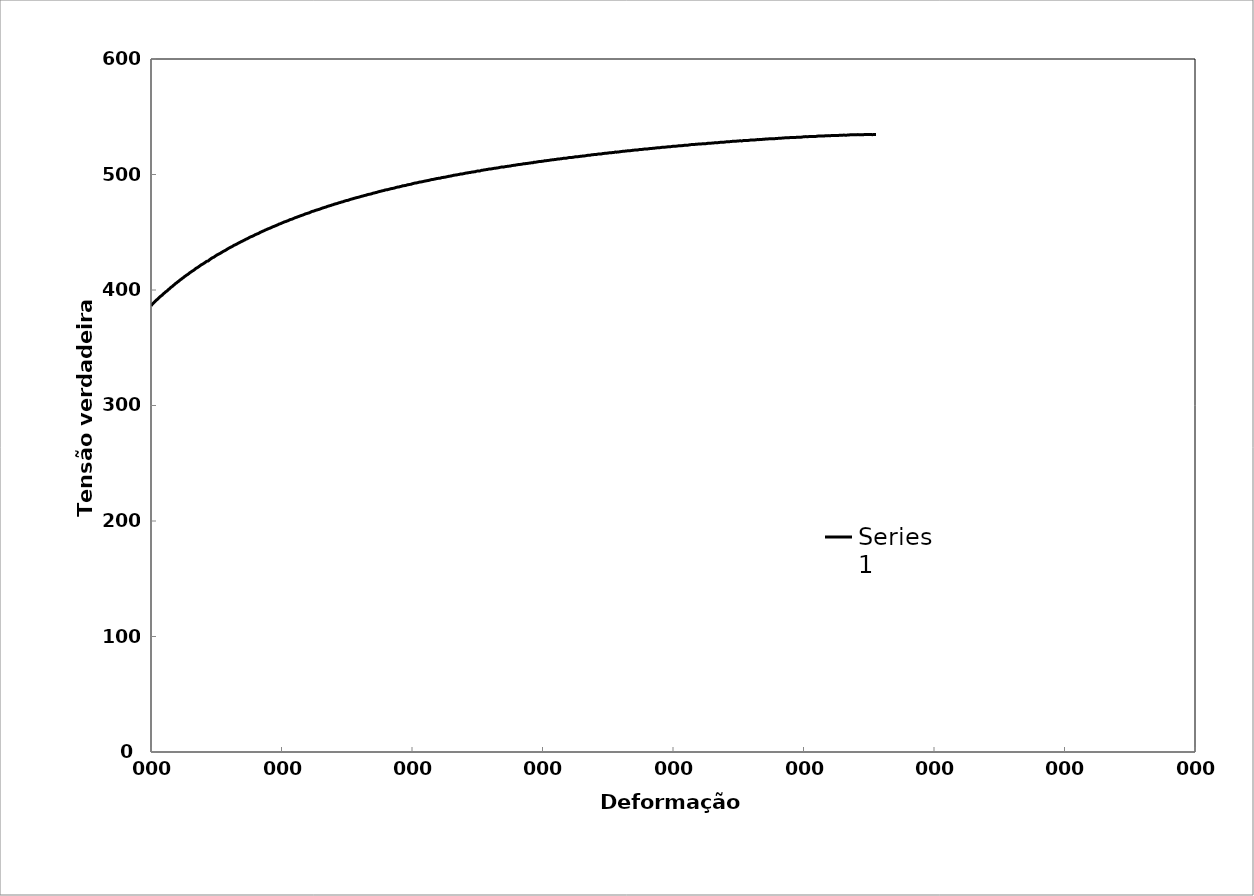
| Category | Series 0 |
|---|---|
| 0.0 | 386.33 |
| 0.00014041254800655975 | 387.275 |
| 0.00028080538309738917 | 388.129 |
| 0.00042117851080681473 | 388.952 |
| 0.0005615319366666198 | 389.682 |
| 0.0007028469516222463 | 390.444 |
| 0.0008510099999309989 | 391.363 |
| 0.0009913031146633437 | 391.91 |
| 0.0011315765499985038 | 392.857 |
| 0.001280656813322744 | 393.5 |
| 0.001428734282625771 | 394.358 |
| 0.0015777702554789427 | 395.001 |
| 0.001725803738766369 | 395.552 |
| 0.0018747954474575175 | 396.596 |
| 0.0020227849708534355 | 397.24 |
| 0.0021717324416675177 | 397.976 |
| 0.0023284952891937 | 398.716 |
| 0.0024930698349769007 | 399.367 |
| 0.0026497823207773906 | 400.23 |
| 0.0028064702516224713 | 400.971 |
| 0.0029631336352060923 | 401.834 |
| 0.0031276037773933438 | 402.578 |
| 0.0032920468736009 | 403.23 |
| 0.003457441518812377 | 404.098 |
| 0.003621830388882058 | 404.843 |
| 0.00378619223969252 | 405.711 |
| 0.003951505182849771 | 406.272 |
| 0.004115812861082431 | 407.11 |
| 0.004280093546736995 | 407.763 |
| 0.004453145792815149 | 408.636 |
| 0.004617371075079819 | 409.289 |
| 0.004790364969413308 | 410.039 |
| 0.004954534885644679 | 410.693 |
| 0.005127470467571657 | 411.567 |
| 0.005300376147954106 | 412.225 |
| 0.00546446236390806 | 412.879 |
| 0.005645121398791624 | 413.541 |
| 0.005817937605281008 | 414.292 |
| 0.005990723951489647 | 415.075 |
| 0.006163480447734227 | 415.734 |
| 0.0063352313313074435 | 416.392 |
| 0.006507928327052735 | 416.959 |
| 0.0066805955036954995 | 417.711 |
| 0.006853232871531088 | 418.588 |
| 0.007024865340524825 | 419.155 |
| 0.007206217644196131 | 419.726 |
| 0.007369991461223198 | 420.382 |
| 0.007550306603846268 | 421.139 |
| 0.007730589238780436 | 421.896 |
| 0.007903045449214791 | 422.371 |
| 0.008075471923632501 | 423.033 |
| 0.008246894762833929 | 423.601 |
| 0.008419261963827546 | 424.386 |
| 0.008591599459489119 | 424.924 |
| 0.008755146562879738 | 425.118 |
| 0.008927426187736141 | 425.966 |
| 0.009099676137435755 | 426.721 |
| 0.009270923509547814 | 427.414 |
| 0.009443114307104872 | 427.984 |
| 0.009623056055096994 | 428.433 |
| 0.009795186234561569 | 429.097 |
| 0.009967286790326737 | 429.791 |
| 0.010139357732587038 | 430.455 |
| 0.010310427169699744 | 430.901 |
| 0.010490212933580972 | 431.382 |
| 0.01067093793280997 | 431.956 |
| 0.010841916464734591 | 432.62 |
| 0.011013836987369147 | 433.192 |
| 0.011185727958417834 | 433.763 |
| 0.01137312342894765 | 434.248 |
| 0.011544952658298985 | 434.82 |
| 0.01171675236743841 | 435.486 |
| 0.011888522566507739 | 436.058 |
| 0.012068024860495474 | 436.634 |
| 0.012247494939192076 | 437.116 |
| 0.012419174004515799 | 437.564 |
| 0.01259082360119691 | 438.231 |
| 0.012770199886097008 | 438.807 |
| 0.012940819896360305 | 439.193 |
| 0.013121102591745357 | 439.677 |
| 0.013291662746593255 | 440.25 |
| 0.013463162659083656 | 440.824 |
| 0.013634633164397114 | 441.273 |
| 0.013813822329065771 | 441.85 |
| 0.01399297939073011 | 442.241 |
| 0.01416435907994524 | 442.815 |
| 0.014343453357103186 | 443.3 |
| 0.014514772997867208 | 443.843 |
| 0.014686063293239286 | 444.231 |
| 0.014865064168886263 | 444.716 |
| 0.01503532715789669 | 445.291 |
| 0.015206528318226976 | 445.866 |
| 0.015377700173736915 | 446.223 |
| 0.015556577299648683 | 446.615 |
| 0.015727689252236138 | 447.097 |
| 0.015906503789657737 | 447.645 |
| 0.01608528635815719 | 448.131 |
| 0.01625630787395014 | 448.52 |
| 0.016435027920100993 | 448.881 |
| 0.016613716031104314 | 449.461 |
| 0.016784647205648533 | 450.038 |
| 0.01696327286033983 | 450.431 |
| 0.017134144300270313 | 450.914 |
| 0.017312707542295087 | 451.276 |
| 0.017491238905180596 | 451.856 |
| 0.017662020162304608 | 452.246 |
| 0.017840489178386522 | 452.702 |
| 0.018011210805614394 | 453.092 |
| 0.01818961751842306 | 453.455 |
| 0.018367992407954163 | 453.849 |
| 0.018546335485558417 | 454.43 |
| 0.018716936662349103 | 454.821 |
| 0.018895217524563426 | 455.184 |
| 0.01907346660837752 | 455.578 |
| 0.019252647175664793 | 456.035 |
| 0.019422164821316708 | 456.426 |
| 0.01959261665873302 | 457.005 |
| 0.019770741486194114 | 457.274 |
| 0.01994113392349267 | 457.666 |
| 0.020127858391870493 | 458.159 |
| 0.020305887913484484 | 458.616 |
| 0.020475227125345878 | 459.008 |
| 0.020654156722798793 | 459.278 |
| 0.02082343697435332 | 459.669 |
| 0.021009996783180197 | 460.037 |
| 0.021180178209490017 | 460.524 |
| 0.021358020502297924 | 461.013 |
| 0.021535831172848206 | 461.19 |
| 0.021713610232384828 | 461.585 |
| 0.021891357692144925 | 462.044 |
| 0.022069073563360478 | 462.535 |
| 0.022247718227114424 | 462.837 |
| 0.022425370784313926 | 463.202 |
| 0.022602991786688273 | 463.599 |
| 0.02278058124544486 | 463.964 |
| 0.02295046164333503 | 464.357 |
| 0.023135665576904926 | 464.632 |
| 0.02331411981825743 | 465.029 |
| 0.023491583044265865 | 465.395 |
| 0.023669014782665525 | 465.886 |
| 0.023846415044628443 | 466.158 |
| 0.024016114490061066 | 466.457 |
| 0.02420112118390076 | 466.732 |
| 0.024379385408372395 | 467.225 |
| 0.024556659706315473 | 467.717 |
| 0.024733902583651615 | 468.083 |
| 0.02491111405151742 | 468.26 |
| 0.025088294121042735 | 468.658 |
| 0.025265442803352335 | 469.056 |
| 0.0254435174151703 | 469.329 |
| 0.025620603186886963 | 469.601 |
| 0.02579765760478553 | 469.905 |
| 0.025974680679966264 | 470.272 |
| 0.026151672423524404 | 470.671 |
| 0.026328632846548655 | 471.038 |
| 0.026505561960121826 | 471.342 |
| 0.026683415894700566 | 471.615 |
| 0.026860282253507305 | 471.919 |
| 0.02703711733613657 | 472.382 |
| 0.027213921153648082 | 472.686 |
| 0.027390693717095668 | 472.959 |
| 0.027576032467181995 | 473.236 |
| 0.027752741036526973 | 473.636 |
| 0.027929418385470098 | 473.909 |
| 0.028106064525041705 | 474.309 |
| 0.02829127074888211 | 474.586 |
| 0.02846785298583599 | 474.796 |
| 0.028644404047008472 | 475.165 |
| 0.028829510603076168 | 475.569 |
| 0.029005997830390567 | 475.748 |
| 0.02918245391545969 | 476.116 |
| 0.02935887886927186 | 476.327 |
| 0.029543853230827304 | 476.7 |
| 0.029727840171133384 | 477.104 |
| 0.029905121983913464 | 477.378 |
| 0.030081419498337002 | 477.557 |
| 0.03026530756914033 | 477.74 |
| 0.030442494132765688 | 478.237 |
| 0.030618696943608872 | 478.543 |
| 0.030794868712490896 | 478.817 |
| 0.030978625647333058 | 479.095 |
| 0.03115568587683163 | 479.402 |
| 0.031339376527065664 | 479.68 |
| 0.03151542138946081 | 479.955 |
| 0.03169143526551708 | 480.166 |
| 0.03187597870652035 | 480.445 |
| 0.03206048809752561 | 480.724 |
| 0.032244012634463075 | 481.129 |
| 0.032428454138507264 | 481.313 |
| 0.032604307395596506 | 481.62 |
| 0.03278012973375483 | 481.895 |
| 0.032955921163852604 | 482.075 |
| 0.03314023142124018 | 482.482 |
| 0.0333159595655046 | 482.757 |
| 0.033507800440735216 | 482.945 |
| 0.03368346401031943 | 483.125 |
| 0.033859096727633285 | 483.432 |
| 0.034043240610969805 | 483.808 |
| 0.03421881015665306 | 484.02 |
| 0.03440288781896907 | 484.299 |
| 0.03457839423844815 | 484.48 |
| 0.03476145730133894 | 484.887 |
| 0.03494543511072013 | 485.167 |
| 0.03512937907849299 | 485.447 |
| 0.03530475805157238 | 485.659 |
| 0.03548768820451629 | 485.939 |
| 0.0356715324643076 | 486.124 |
| 0.035846816389183536 | 486.528 |
| 0.03603059464323902 | 486.713 |
| 0.03621339207909043 | 486.802 |
| 0.03639710298303865 | 487.082 |
| 0.03657225978432808 | 487.391 |
| 0.036747385911085235 | 487.667 |
| 0.03693099874973483 | 487.852 |
| 0.03712214743087053 | 488.041 |
| 0.037297177292831 | 488.254 |
| 0.03747974336830453 | 488.63 |
| 0.03765565634290749 | 488.94 |
| 0.037838156989967384 | 489.125 |
| 0.03802156967658873 | 489.214 |
| 0.03819644219733031 | 489.587 |
| 0.03838734916667607 | 489.776 |
| 0.0385621577399225 | 490.181 |
| 0.03874543769584376 | 490.271 |
| 0.038927739583551106 | 490.456 |
| 0.03911095255403086 | 490.642 |
| 0.039285634691998875 | 491.047 |
| 0.03946783813633674 | 491.233 |
| 0.039650952189530735 | 491.418 |
| 0.03983403271810679 | 491.508 |
| 0.04001613627892323 | 491.918 |
| 0.04019066038279569 | 492.195 |
| 0.04038118705757806 | 492.513 |
| 0.04056413395539384 | 492.603 |
| 0.04073856245500153 | 492.785 |
| 0.040921443989755155 | 493.067 |
| 0.04110334965473327 | 493.381 |
| 0.04128616449490725 | 493.471 |
| 0.04146800383328709 | 493.657 |
| 0.04165075202750881 | 493.843 |
| 0.04183346683092983 | 494.126 |
| 0.04201520668448455 | 494.344 |
| 0.04219785491485797 | 494.53 |
| 0.04237952856265369 | 494.716 |
| 0.042562110268474056 | 494.903 |
| 0.042743717758729434 | 495.185 |
| 0.042926232988438555 | 495.5 |
| 0.043108714912417315 | 495.686 |
| 0.04329022317130638 | 495.776 |
| 0.04347263869179969 | 496.059 |
| 0.04366254114643659 | 496.282 |
| 0.04384394891823633 | 496.564 |
| 0.04402626346772428 | 496.655 |
| 0.044207605275447474 | 496.745 |
| 0.04438985354318405 | 496.932 |
| 0.044572068602541835 | 497.344 |
| 0.04475331146894793 | 497.434 |
| 0.04494297089939272 | 497.625 |
| 0.0451166373410423 | 497.711 |
| 0.04529872002961146 | 497.995 |
| 0.04548076957011075 | 498.214 |
| 0.045670291094506175 | 498.501 |
| 0.045851335043184484 | 498.591 |
| 0.04603328401731605 | 498.779 |
| 0.04621426226619365 | 499.062 |
| 0.046403644842062726 | 499.382 |
| 0.0465854933608734 | 499.473 |
| 0.0467663717084947 | 499.563 |
| 0.046948154283917166 | 499.847 |
| 0.04713739793755902 | 499.942 |
| 0.04731068373169552 | 500.254 |
| 0.04749985879786226 | 500.445 |
| 0.047681508099105395 | 500.439 |
| 0.04787061303418436 | 500.727 |
| 0.0480512591017628 | 500.914 |
| 0.04824029413463484 | 501.235 |
| 0.04842180899830003 | 501.326 |
| 0.04861077400385289 | 501.517 |
| 0.0487912864257957 | 501.704 |
| 0.04897270131278741 | 501.796 |
| 0.04916156225746653 | 502.084 |
| 0.04934290998943431 | 502.175 |
| 0.049523290312018985 | 502.362 |
| 0.04970457246323196 | 502.453 |
| 0.049893295249639404 | 502.871 |
| 0.0500735763298153 | 502.962 |
| 0.0502622294961989 | 503.057 |
| 0.050450847079278334 | 503.152 |
| 0.05062355969944523 | 503.562 |
| 0.05081210914803002 | 503.657 |
| 0.05100062305242197 | 503.946 |
| 0.051181637611525325 | 504.037 |
| 0.051370081874095176 | 504.229 |
| 0.05155849063211545 | 504.324 |
| 0.051739404246358346 | 504.642 |
| 0.051919352844946344 | 504.732 |
| 0.05210765815366165 | 504.827 |
| 0.05229592801016338 | 505.02 |
| 0.05247670827317851 | 505.208 |
| 0.052664908668023196 | 505.4 |
| 0.05285307365014382 | 505.495 |
| 0.05303282197503336 | 505.683 |
| 0.053220917747995804 | 505.779 |
| 0.053408978147591914 | 506.1 |
| 0.05359700318712365 | 506.293 |
| 0.05378499287988608 | 506.485 |
| 0.053965504173963195 | 506.382 |
| 0.05414505267044748 | 506.57 |
| 0.05433293937345839 | 506.86 |
| 0.054513351793017924 | 506.952 |
| 0.05470116931675902 | 507.144 |
| 0.05488895157170189 | 507.239 |
| 0.055069263716678106 | 507.331 |
| 0.05526441032815837 | 507.657 |
| 0.05544465479216825 | 507.846 |
| 0.055631368661138623 | 507.941 |
| 0.05581897633874366 | 508.036 |
| 0.05599912088201194 | 508.323 |
| 0.05618665958562937 | 508.418 |
| 0.05637416312507599 | 508.741 |
| 0.05656163151353593 | 508.739 |
| 0.05674164233322921 | 508.83 |
| 0.0569206931140857 | 509.019 |
| 0.05711640625490009 | 509.314 |
| 0.05729538995255964 | 509.307 |
| 0.05747526874811638 | 509.497 |
| 0.05766994644589806 | 509.596 |
| 0.05784975788535603 | 509.785 |
| 0.058036949876309564 | 509.881 |
| 0.058224106832979634 | 510.074 |
| 0.058402892397772015 | 510.165 |
| 0.05859831569590757 | 510.265 |
| 0.058785367628365885 | 510.588 |
| 0.05859831569590757 | 510.493 |
| 0.058785367628365885 | 510.686 |
| 0.05897238457894229 | 510.684 |
| 0.059166771068027306 | 510.881 |
| 0.05936204515804352 | 511.078 |
| 0.05955635592448919 | 511.275 |
| 0.059766354153689936 | 511.285 |
| 0.05996151120717883 | 511.483 |
| 0.06016310267074055 | 511.586 |
| 0.060358182318865965 | 511.914 |
| 0.06055229964028679 | 511.915 |
| 0.060738986467208426 | 512.109 |
| 0.06094134519448042 | 512.212 |
| 0.061127959412623424 | 512.406 |
| 0.06132192737896024 | 512.603 |
| 0.06150847059519208 | 512.699 |
| 0.06169497901954269 | 512.795 |
| 0.06188976008762335 | 512.993 |
| 0.06208358035961544 | 513.092 |
| 0.0622782857575843 | 513.323 |
| 0.06247203074734508 | 513.422 |
| 0.0626509808640941 | 513.514 |
| 0.06284465366649017 | 513.614 |
| 0.06303828896699462 | 513.811 |
| 0.0632245123120119 | 514.005 |
| 0.0634107009843517 | 514.101 |
| 0.06359685499692297 | 514.098 |
| 0.06379126600359378 | 514.296 |
| 0.06397734919252804 | 514.589 |
| 0.06417076530856178 | 514.688 |
| 0.06435677789901958 | 514.784 |
| 0.06454275589522845 | 514.781 |
| 0.06472869931005354 | 514.975 |
| 0.06492289041956378 | 515.174 |
| 0.06511612375678033 | 515.405 |
| 0.0653019605980889 | 515.369 |
| 0.06548776291048253 | 515.465 |
| 0.06566617422260082 | 515.557 |
| 0.06585926399983269 | 515.886 |
| 0.06604496280242503 | 515.883 |
| 0.06623797946036183 | 516.082 |
| 0.0664236079557878 | 516.079 |
| 0.06660920199967058 | 516.273 |
| 0.06680302831077536 | 516.472 |
| 0.0669802867839418 | 516.662 |
| 0.06716577754988001 | 516.659 |
| 0.06735123391537504 | 516.755 |
| 0.06752931310233609 | 517.044 |
| 0.06770736058274629 | 517.136 |
| 0.06788445884200284 | 517.228 |
| 0.0680541868051838 | 517.316 |
| 0.06820921041907643 | 517.297 |
| 0.06835595619420784 | 517.472 |
| 0.06852560415675304 | 517.691 |
| 0.0687025575785816 | 517.783 |
| 0.06888039630682505 | 517.743 |
| 0.06906553498722348 | 517.839 |
| 0.06925063939763551 | 518.165 |
| 0.06943570955074588 | 518.261 |
| 0.06962074545923222 | 518.357 |
| 0.06981307323030644 | 518.358 |
| 0.06999803933259083 | 518.553 |
| 0.07018297122874306 | 518.748 |
| 0.07037610615239376 | 518.848 |
| 0.07056096815160792 | 518.845 |
| 0.07075311519409541 | 519.043 |
| 0.0709452253231897 | 519.044 |
| 0.07113821309924781 | 519.441 |
| 0.07133024926847867 | 519.343 |
| 0.07152316276109 | 519.443 |
| 0.0717151250273825 | 519.543 |
| 0.07190796429371049 | 519.742 |
| 0.07209985271392458 | 519.941 |
| 0.07229170432003673 | 520.041 |
| 0.07248443244199534 | 520.042 |
| 0.07267621028712823 | 520.241 |
| 0.07286886432535533 | 520.341 |
| 0.07306787075446752 | 520.577 |
| 0.07325223586361915 | 520.541 |
| 0.07345207845402518 | 520.645 |
| 0.07364458309046903 | 520.745 |
| 0.07382884191443373 | 520.973 |
| 0.07401306679333902 | 521.069 |
| 0.07419725773968941 | 521.165 |
| 0.07437321047176385 | 521.124 |
| 0.07455733510095847 | 521.22 |
| 0.07473413575685733 | 521.445 |
| 0.07491819394892324 | 521.64 |
| 0.07508673237950048 | 521.728 |
| 0.07527072569067864 | 521.725 |
| 0.07543920472158516 | 521.912 |
| 0.07563041679730137 | 522.012 |
| 0.0757997455367076 | 522.1 |
| 0.07597541655722079 | 522.093 |
| 0.07615196669518831 | 522.185 |
| 0.07632757585697855 | 522.276 |
| 0.07650406383760433 | 522.568 |
| 0.07668779657793112 | 522.465 |
| 0.07686422100098528 | 522.656 |
| 0.07703970513989722 | 522.649 |
| 0.07721152246305149 | 522.838 |
| 0.07739330759352844 | 522.933 |
| 0.07757505968417777 | 523.128 |
| 0.07774769357809133 | 523.118 |
| 0.07793846479401884 | 523.218 |
| 0.07811103596870306 | 523.308 |
| 0.07829265766936322 | 523.503 |
| 0.07846516773666132 | 523.494 |
| 0.07866487906368075 | 523.598 |
| 0.07883732493652529 | 523.689 |
| 0.07900974107691794 | 523.779 |
| 0.07919119964135277 | 523.974 |
| 0.07937262528455091 | 524.069 |
| 0.07955401801845535 | 524.064 |
| 0.07973537785500295 | 524.159 |
| 0.07991670480612442 | 524.354 |
| 0.08009799888374367 | 524.449 |
| 0.08027926009977765 | 524.544 |
| 0.08045142782781559 | 524.535 |
| 0.08063262499801133 | 524.63 |
| 0.08082284669744588 | 524.829 |
| 0.08100397658618394 | 524.924 |
| 0.08118507367282696 | 524.82 |
| 0.08135708553301607 | 525.01 |
| 0.08154716948733468 | 525.01 |
| 0.0817372173166101 | 525.309 |
| 0.0819181816761734 | 525.304 |
| 0.08209911329356256 | 525.4 |
| 0.0822890562660174 | 525.399 |
| 0.08247896316699105 | 525.599 |
| 0.08265979335889273 | 525.794 |
| 0.08284962987406427 | 525.894 |
| 0.08303943035817343 | 525.894 |
| 0.0832382303299117 | 525.898 |
| 0.08342795707879028 | 526.098 |
| 0.08361764783825762 | 526.198 |
| 0.08380730262196492 | 526.298 |
| 0.08400595001446831 | 526.302 |
| 0.08419553117608514 | 526.402 |
| 0.08438507640349768 | 526.502 |
| 0.08457458571032547 | 526.601 |
| 0.08477308075762344 | 526.706 |
| 0.08496251655524109 | 526.672 |
| 0.08514289824338125 | 526.767 |
| 0.08534128052669065 | 527.005 |
| 0.08553962346227548 | 527.11 |
| 0.08571990109030994 | 527.071 |
| 0.0859091576281111 | 527.171 |
| 0.08609837835465256 | 527.271 |
| 0.08628756328348425 | 527.37 |
| 0.08647671242814836 | 527.604 |
| 0.08666582580217941 | 527.469 |
| 0.08686390622347773 | 527.574 |
| 0.0870529463950771 | 527.674 |
| 0.08724195083724395 | 527.874 |
| 0.08743991718361183 | 527.978 |
| 0.08763784434706196 | 527.982 |
| 0.08782673828367857 | 527.981 |
| 0.0880155965461144 | 528.182 |
| 0.08820441914784166 | 528.282 |
| 0.08841118395361253 | 528.391 |
| 0.08859993188131621 | 528.39 |
| 0.08878864418996263 | 528.49 |
| 0.08898630461000553 | 528.594 |
| 0.08917494402632176 | 528.795 |
| 0.0893815082797651 | 528.702 |
| 0.08957905156034437 | 528.706 |
| 0.08977655582528293 | 528.911 |
| 0.08996504624200094 | 529.011 |
| 0.09017144736986327 | 529.12 |
| 0.09036883468029466 | 529.124 |
| 0.09055721350169008 | 529.089 |
| 0.09076349245434503 | 529.332 |
| 0.0909607629486989 | 529.437 |
| 0.09115799453508033 | 529.541 |
| 0.09136414960924194 | 529.516 |
| 0.09155234104529478 | 529.515 |
| 0.09175841484732408 | 529.725 |
| 0.0919554891897785 | 529.829 |
| 0.09216147993883539 | 529.938 |
| 0.09235847487133003 | 529.84 |
| 0.09255543100446459 | 529.945 |
| 0.09276129822083751 | 530.054 |
| 0.09296712306462265 | 530.264 |
| 0.09317290555325908 | 530.171 |
| 0.09336970136035458 | 530.377 |
| 0.09357540103061884 | 530.283 |
| 0.09378105839723047 | 530.494 |
| 0.09397773457054623 | 530.497 |
| 0.09418330921944704 | 530.707 |
| 0.0943888416160974 | 530.715 |
| 0.09460326517492054 | 530.829 |
| 0.09479977972209574 | 530.933 |
| 0.09501411519365058 | 531.047 |
| 0.09521947692119653 | 531.021 |
| 0.09542479648396224 | 531.028 |
| 0.09563899804845266 | 531.041 |
| 0.09584423150222604 | 531.251 |
| 0.09604942284387136 | 531.259 |
| 0.09626349066851103 | 531.372 |
| 0.09646859600865706 | 531.38 |
| 0.09668257413021067 | 531.494 |
| 0.09689650647492287 | 531.506 |
| 0.09710148203453309 | 531.716 |
| 0.09731532478964267 | 531.728 |
| 0.09752912182580464 | 531.741 |
| 0.09774287316256436 | 531.854 |
| 0.09795657881945408 | 531.968 |
| 0.09816133722750511 | 532.077 |
| 0.09839275277966303 | 532.064 |
| 0.09859742190603984 | 532.072 |
| 0.09881984084637438 | 532.088 |
| 0.09903331649761851 | 532.304 |
| 0.09925563851864111 | 532.32 |
| 0.09947791112356877 | 532.337 |
| 0.09970013433436409 | 532.353 |
| 0.09991342216710206 | 532.569 |
| 0.10013554862905205 | 532.687 |
| 0.10036650782136616 | 532.81 |
| 0.10057965358723339 | 532.686 |
| 0.10081051024403359 | 532.809 |
| 0.10103243755043614 | 532.825 |
| 0.10125431561603723 | 532.943 |
| 0.10148501659310297 | 532.964 |
| 0.10170679427519336 | 532.98 |
| 0.10192852278284903 | 532.997 |
| 0.10216793436353244 | 533.226 |
| 0.10239842468839189 | 533.247 |
| 0.10262886189970322 | 533.37 |
| 0.10286810588983913 | 533.259 |
| 0.1030984349069981 | 533.28 |
| 0.10332871088491735 | 533.505 |
| 0.10356778751897164 | 533.53 |
| 0.10380680700905048 | 533.658 |
| 0.10404576938246443 | 533.581 |
| 0.1042846746665044 | 533.708 |
| 0.1045235228884418 | 533.836 |
| 0.10476231407552847 | 533.861 |
| 0.10500988916720219 | 533.857 |
| 0.10524856425640192 | 533.779 |
| 0.10549601900879571 | 533.911 |
| 0.10574341254248376 | 534.043 |
| 0.10598191264298953 | 534.068 |
| 0.10623801607485053 | 534.103 |
| 0.10649405393453662 | 534 |
| 0.10674120071450122 | 534.132 |
| 0.1070059330716358 | 534.274 |
| 0.10725295339031285 | 534.406 |
| 0.10751755032253235 | 534.342 |
| 0.10778207726173467 | 534.381 |
| 0.10803772013884491 | 534.38 |
| 0.10831092130914 | 534.526 |
| 0.10857523849129555 | 534.462 |
| 0.10884829287045017 | 534.403 |
| 0.10912127271126337 | 534.446 |
| 0.10939417805441898 | 534.592 |
| 0.10967580869769433 | 534.605 |
| 0.10995736004748122 | 534.55 |
| 0.11023883214841781 | 534.597 |
| 0.1105290172973713 | 534.512 |
| 0.11081911826333218 | 534.565 |
| 0.1111179221710982 | 534.621 |